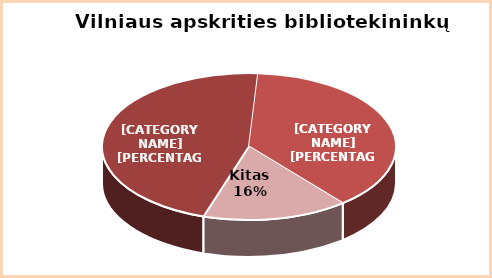
| Category | Series 1 | Series 0 |
|---|---|---|
| Aukštasis | 0.46 | 0.47 |
| Aukštesnysis | 0.38 | 0.48 |
| Kitas | 0.16 | 0.05 |